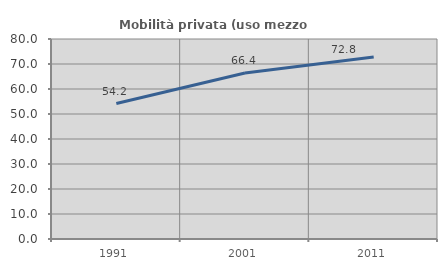
| Category | Mobilità privata (uso mezzo privato) |
|---|---|
| 1991.0 | 54.171 |
| 2001.0 | 66.388 |
| 2011.0 | 72.83 |